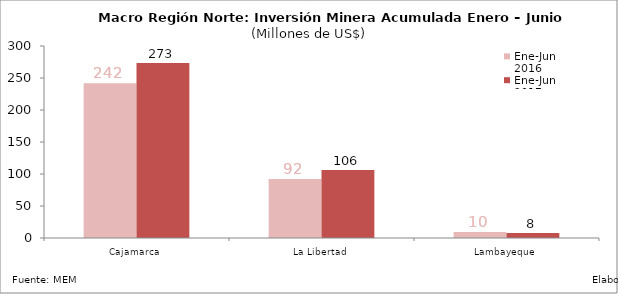
| Category | Ene-Jun 2016 | Ene-Jun 2017 |
|---|---|---|
| Cajamarca | 241.983 | 273.287 |
| La Libertad | 92.154 | 106.15 |
| Lambayeque | 9.558 | 7.719 |